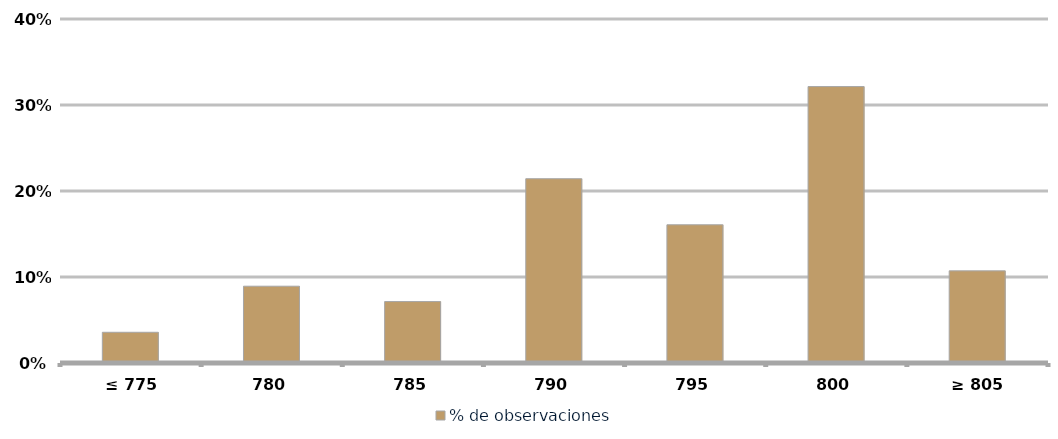
| Category | % de observaciones  |
|---|---|
|  ≤ 775  | 0.036 |
|  780  | 0.089 |
|  785  | 0.071 |
|  790  | 0.214 |
|  795  | 0.161 |
| 800 | 0.321 |
|  ≥ 805  | 0.107 |